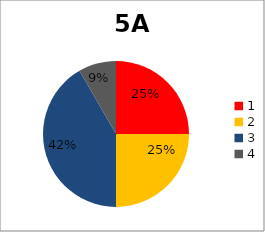
| Category | Series 0 |
|---|---|
| 0 | 3 |
| 1 | 3 |
| 2 | 5 |
| 3 | 1 |